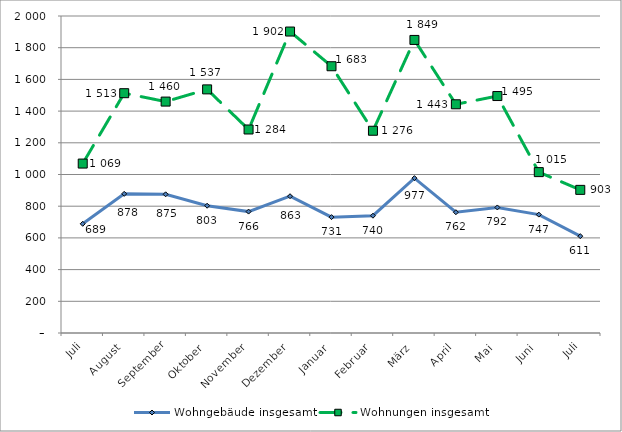
| Category | Wohngebäude insgesamt | Wohnungen insgesamt |
|---|---|---|
| Juli | 689 | 1069 |
| August | 878 | 1513 |
| September | 875 | 1460 |
| Oktober | 803 | 1537 |
| November | 766 | 1284 |
| Dezember | 863 | 1902 |
| Januar | 731 | 1683 |
| Februar | 740 | 1276 |
| März | 977 | 1849 |
| April | 762 | 1443 |
| Mai | 792 | 1495 |
| Juni | 747 | 1015 |
| Juli | 611 | 903 |